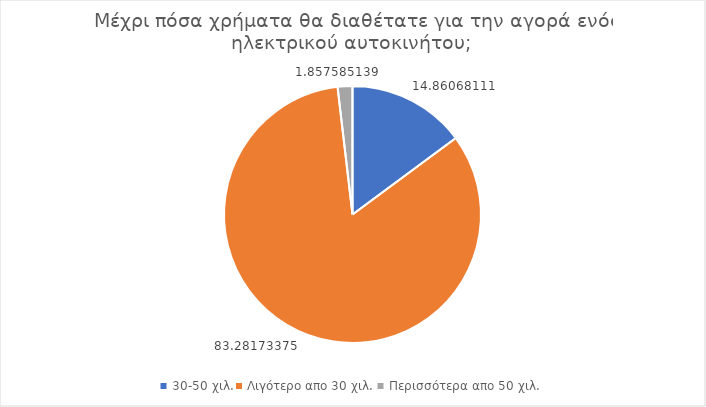
| Category | Series 0 |
|---|---|
| 30-50 χιλ. | 14.861 |
| Λιγότερο απο 30 χιλ. | 83.282 |
| Περισσότερα απο 50 χιλ. | 1.858 |